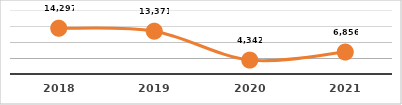
| Category | SERVICIOS TECNOLÓGICOS PROPORCIONADOS
TERCER TRIMESTRE, EJERCICIO 2021 |
|---|---|
| 2018.0 | 14297 |
| 2019.0 | 13371 |
| 2020.0 | 4342 |
| 2021.0 | 6856 |